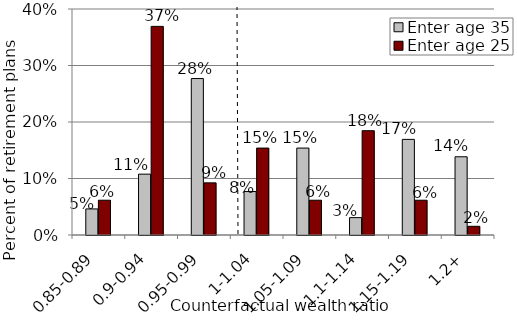
| Category | Enter age 35 | Enter age 25 |
|---|---|---|
| 0.85-0.89 | 0.046 | 0.062 |
| 0.9-0.94 | 0.108 | 0.369 |
| 0.95-0.99 | 0.277 | 0.092 |
| 1-1.04 | 0.077 | 0.154 |
| 1.05-1.09 | 0.154 | 0.062 |
| 1.1-1.14 | 0.031 | 0.185 |
| 1.15-1.19 | 0.169 | 0.062 |
| 1.2+ | 0.138 | 0.015 |